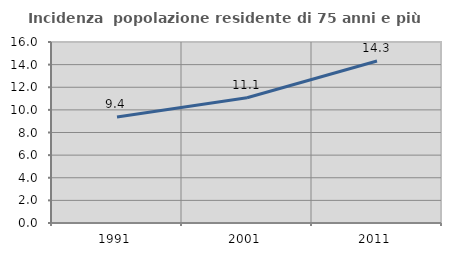
| Category | Incidenza  popolazione residente di 75 anni e più |
|---|---|
| 1991.0 | 9.369 |
| 2001.0 | 11.077 |
| 2011.0 | 14.318 |